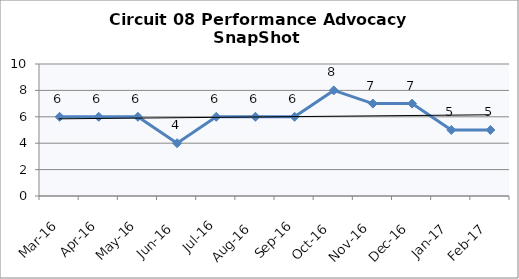
| Category | Circuit 08 |
|---|---|
| Mar-16 | 6 |
| Apr-16 | 6 |
| May-16 | 6 |
| Jun-16 | 4 |
| Jul-16 | 6 |
| Aug-16 | 6 |
| Sep-16 | 6 |
| Oct-16 | 8 |
| Nov-16 | 7 |
| Dec-16 | 7 |
| Jan-17 | 5 |
| Feb-17 | 5 |